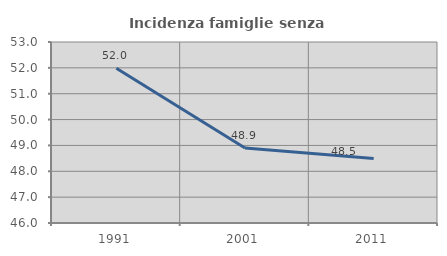
| Category | Incidenza famiglie senza nuclei |
|---|---|
| 1991.0 | 51.984 |
| 2001.0 | 48.899 |
| 2011.0 | 48.498 |